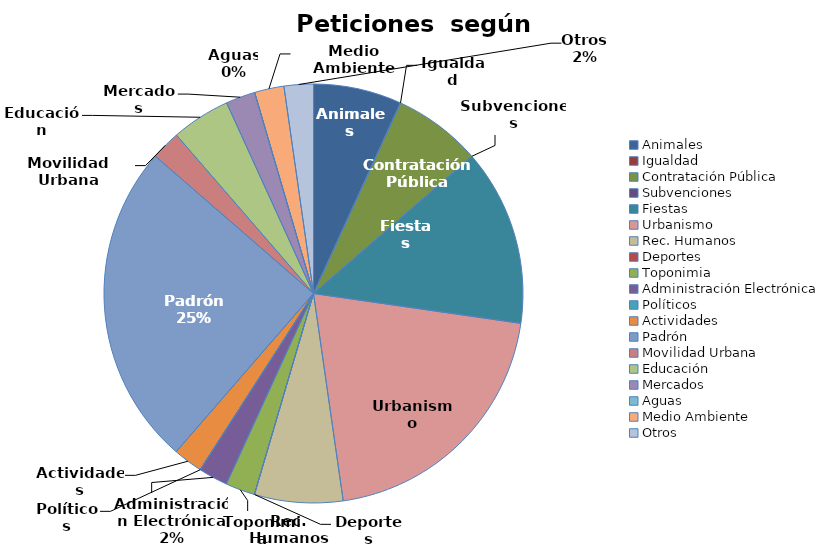
| Category | Peticiones  según Temática |
|---|---|
| Animales | 3 |
| Igualdad | 0 |
| Contratación Pública | 3 |
| Subvenciones | 0 |
| Fiestas | 6 |
| Urbanismo | 9 |
| Rec. Humanos | 3 |
| Deportes | 0 |
| Toponimia | 1 |
| Administración Electrónica | 1 |
| Políticos | 0 |
| Actividades | 1 |
| Padrón  | 11 |
| Movilidad Urbana | 1 |
| Educación | 2 |
| Mercados | 1 |
| Aguas | 0 |
| Medio Ambiente | 1 |
| Otros | 1 |